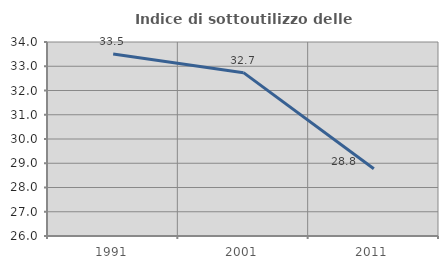
| Category | Indice di sottoutilizzo delle abitazioni  |
|---|---|
| 1991.0 | 33.508 |
| 2001.0 | 32.735 |
| 2011.0 | 28.774 |